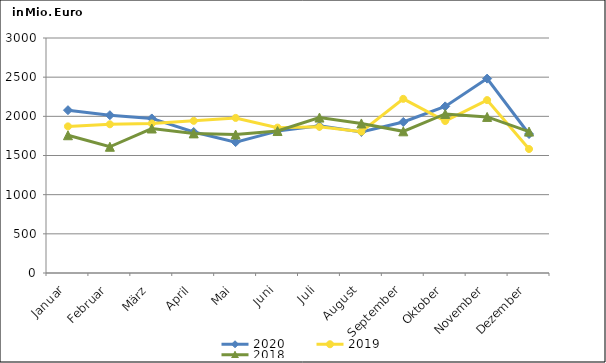
| Category | 2020 | 2019 | 2018 |
|---|---|---|---|
| Januar | 2078.528 | 1871.773 | 1758.692 |
| Februar | 2014.469 | 1898.436 | 1611.697 |
| März | 1973.117 | 1908.612 | 1844.551 |
| April | 1799.811 | 1942.56 | 1782.309 |
| Mai | 1670.968 | 1979.751 | 1767.755 |
| Juni | 1811.327 | 1855.834 | 1812.405 |
| Juli | 1878.978 | 1865.603 | 1984.258 |
| August | 1800.621 | 1804.466 | 1909.185 |
| September | 1928.098 | 2223.139 | 1808.633 |
| Oktober | 2126.967 | 1940.168 | 2030.236 |
| November | 2481.514 | 2207.415 | 1992.673 |
| Dezember | 1774.152 | 1582.789 | 1805.128 |